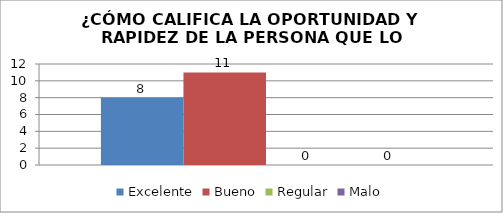
| Category | Excelente | Bueno | Regular | Malo |
|---|---|---|---|---|
| 0 | 8 | 11 | 0 | 0 |